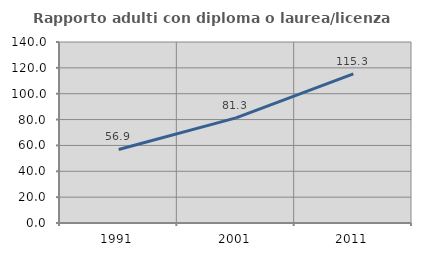
| Category | Rapporto adulti con diploma o laurea/licenza media  |
|---|---|
| 1991.0 | 56.863 |
| 2001.0 | 81.319 |
| 2011.0 | 115.296 |